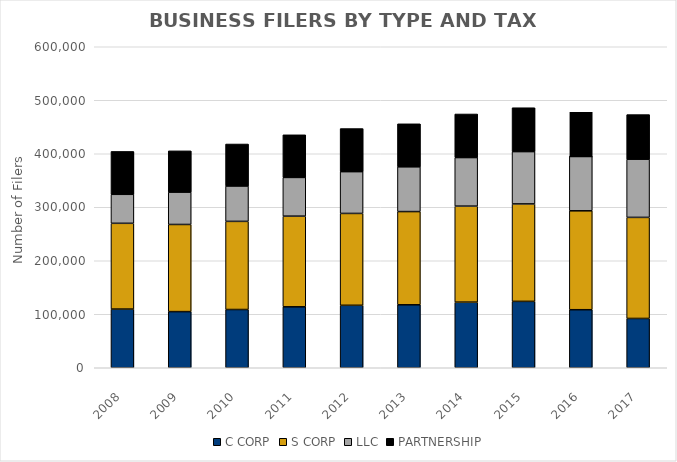
| Category | C CORP | S CORP | LLC | PARTNERSHIP |
|---|---|---|---|---|
| 2008.0 | 109696 | 160281 | 54217 | 80195 |
| 2009.0 | 104918 | 162906 | 60472 | 77165 |
| 2010.0 | 108861 | 164745 | 66126 | 78511 |
| 2011.0 | 113909 | 169451 | 72408 | 79650 |
| 2012.0 | 116744 | 171710 | 78089 | 80563 |
| 2013.0 | 117681 | 174238 | 83645 | 80409 |
| 2014.0 | 122660 | 179419 | 90814 | 81455 |
| 2015.0 | 124069 | 182173 | 97770 | 82031 |
| 2016.0 | 108470 | 184888 | 102470 | 82868 |
| 2017.0 | 92168 | 188887 | 108797 | 83313 |